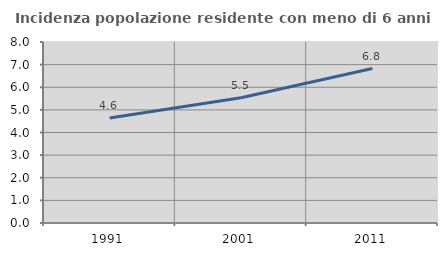
| Category | Incidenza popolazione residente con meno di 6 anni |
|---|---|
| 1991.0 | 4.64 |
| 2001.0 | 5.539 |
| 2011.0 | 6.828 |